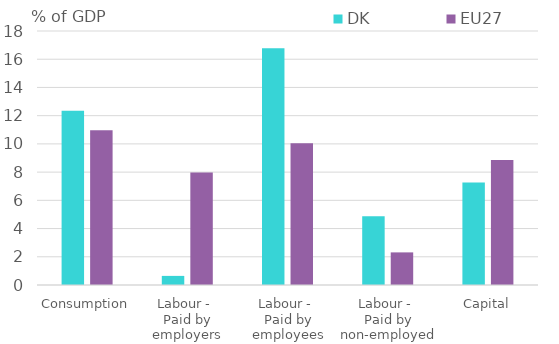
| Category | DK | EU27 |
|---|---|---|
| Consumption | 12.344 | 10.967 |
| Labour - 
Paid by employers | 0.645 | 7.966 |
| Labour - 
Paid by employees | 16.772 | 10.052 |
| Labour - 
Paid by non-employed | 4.878 | 2.311 |
| Capital | 7.261 | 8.858 |